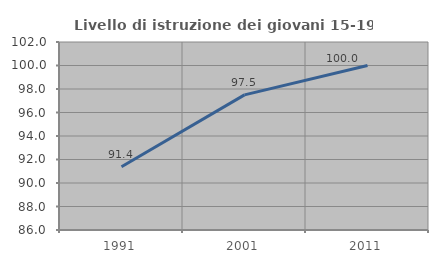
| Category | Livello di istruzione dei giovani 15-19 anni |
|---|---|
| 1991.0 | 91.379 |
| 2001.0 | 97.5 |
| 2011.0 | 100 |